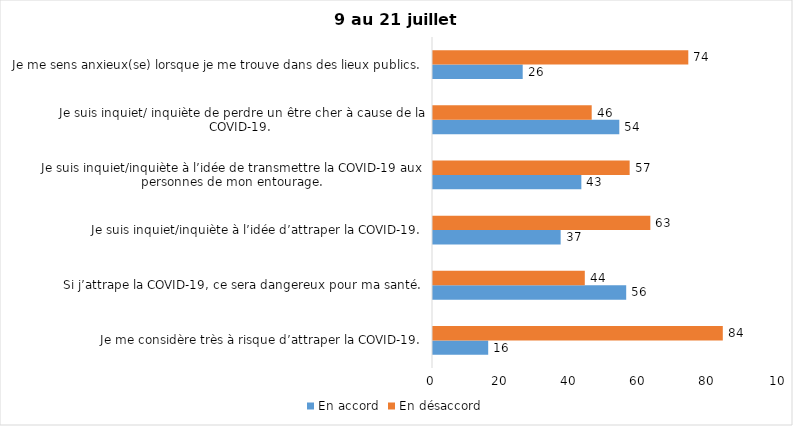
| Category | En accord | En désaccord |
|---|---|---|
| Je me considère très à risque d’attraper la COVID-19. | 16 | 84 |
| Si j’attrape la COVID-19, ce sera dangereux pour ma santé. | 56 | 44 |
| Je suis inquiet/inquiète à l’idée d’attraper la COVID-19. | 37 | 63 |
| Je suis inquiet/inquiète à l’idée de transmettre la COVID-19 aux personnes de mon entourage. | 43 | 57 |
| Je suis inquiet/ inquiète de perdre un être cher à cause de la COVID-19. | 54 | 46 |
| Je me sens anxieux(se) lorsque je me trouve dans des lieux publics. | 26 | 74 |